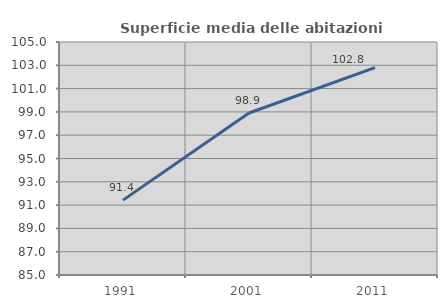
| Category | Superficie media delle abitazioni occupate |
|---|---|
| 1991.0 | 91.426 |
| 2001.0 | 98.903 |
| 2011.0 | 102.803 |